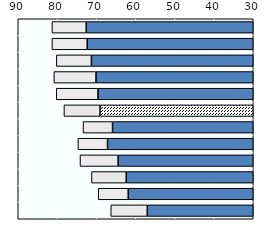
| Category | Series 1 | Series 0 |
|---|---|---|
| 0 | 72.64 | 8.76 |
| 1 | 72.39 | 9.01 |
| 2 | 71.32 | 8.95 |
| 3 | 70.15 | 10.75 |
| 4 | 69.64 | 10.66 |
| 5 | 69.123 | 9.209 |
| 6 | 65.93 | 7.53 |
| 7 | 67.21 | 7.55 |
| 8 | 64.5 | 9.734 |
| 9 | 62.43 | 8.871 |
| 10 | 61.92 | 7.652 |
| 11 | 57.06 | 9.32 |